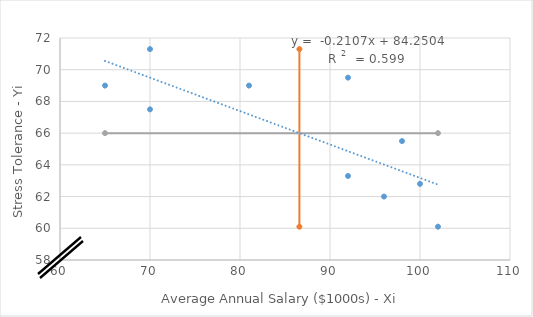
| Category | Stress Tolerance - Yi |
|---|---|
| 81.0 | 69 |
| 96.0 | 62 |
| 70.0 | 67.5 |
| 70.0 | 71.3 |
| 92.0 | 63.3 |
| 92.0 | 69.5 |
| 100.0 | 62.8 |
| 98.0 | 65.5 |
| 102.0 | 60.1 |
| 65.0 | 69 |